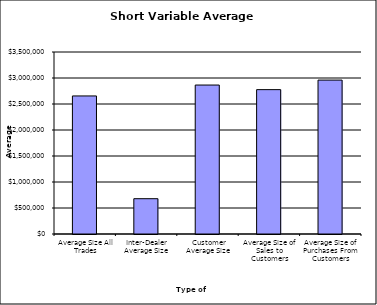
| Category | Security Type |
|---|---|
| Average Size All Trades | 2654942.494 |
| Inter-Dealer Average Size | 679003.256 |
| Customer Average Size | 2864563.735 |
| Average Size of Sales to Customers | 2776227.61 |
| Average Size of Purchases From Customers | 2959947.482 |